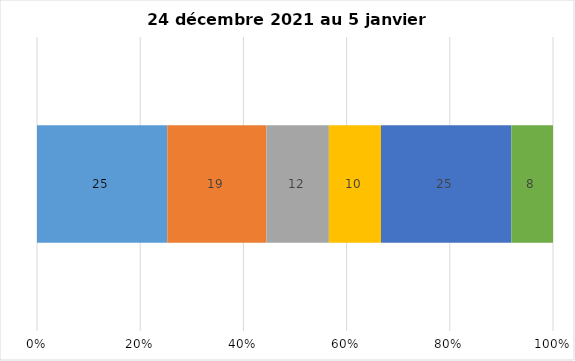
| Category | Plusieurs fois par jour | Une fois par jour | Quelques fois par semaine   | Une fois par semaine ou moins   |  Jamais   |  Je n’utilise pas les médias sociaux |
|---|---|---|---|---|---|---|
| 0 | 25 | 19 | 12 | 10 | 25 | 8 |